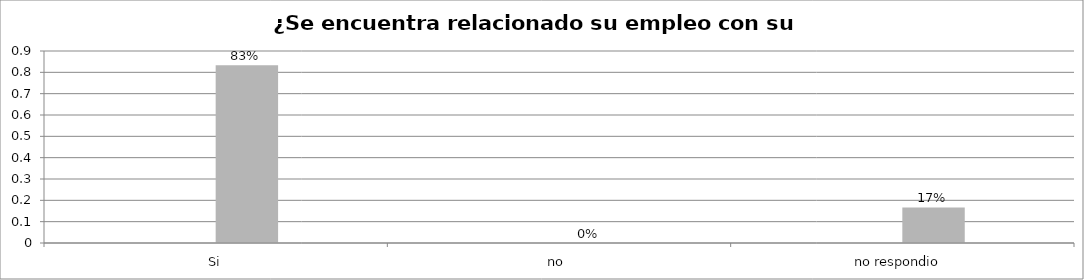
| Category | Series 0 | Series 1 | Series 2 | Series 3 |
|---|---|---|---|---|
| Si |  |  | 0.833 |  |
| no  |  |  | 0 |  |
| no respondio  |  |  | 0.167 |  |